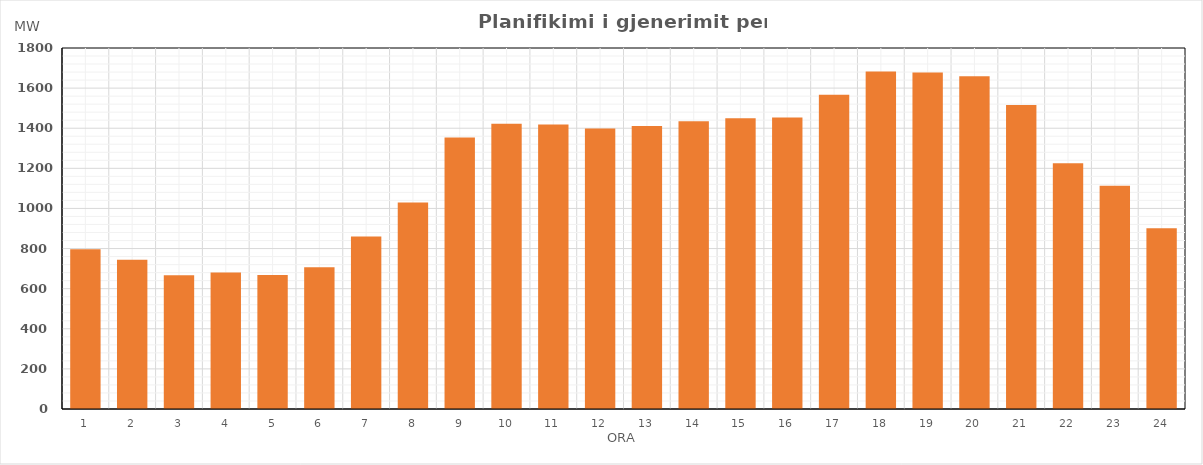
| Category | Max (MW) |
|---|---|
| 0 | 796.449 |
| 1 | 743.876 |
| 2 | 667.08 |
| 3 | 680.327 |
| 4 | 668.125 |
| 5 | 706.764 |
| 6 | 859.852 |
| 7 | 1029.162 |
| 8 | 1354.002 |
| 9 | 1422.289 |
| 10 | 1418.729 |
| 11 | 1398.795 |
| 12 | 1410.587 |
| 13 | 1434.328 |
| 14 | 1450.079 |
| 15 | 1453.205 |
| 16 | 1566.655 |
| 17 | 1683.343 |
| 18 | 1677.483 |
| 19 | 1659.004 |
| 20 | 1515.32 |
| 21 | 1225.347 |
| 22 | 1113.361 |
| 23 | 901.107 |